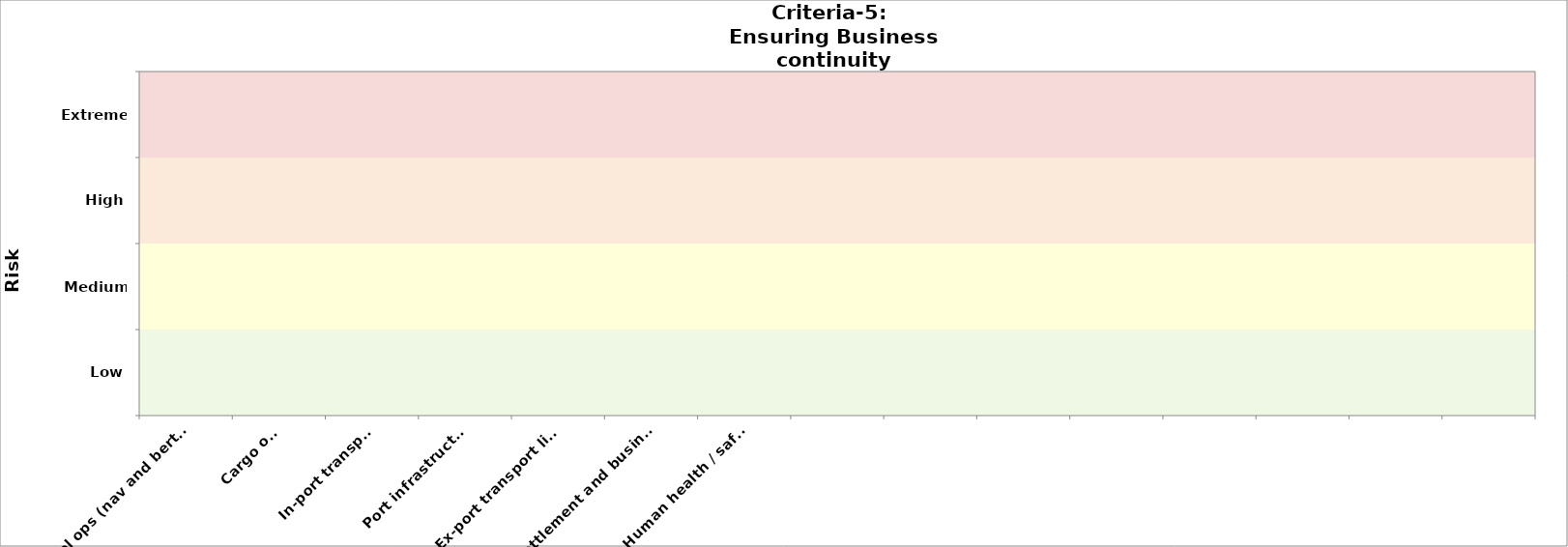
| Category | Criteria-3 (public health) | Criteria-5 
2050 |
|---|---|---|
| Vessel ops (nav and berthing) |  | 0 |
| Cargo ops |  | 0 |
| In-port transport |  | 0 |
| Port infrastructure |  | 0 |
| Ex-port transport links |  | 0 |
| Ex-port settlement and businesses |  | 0 |
| Human health / safety  |  | 0 |